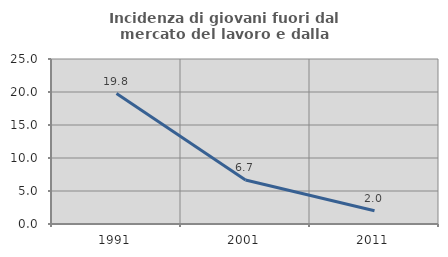
| Category | Incidenza di giovani fuori dal mercato del lavoro e dalla formazione  |
|---|---|
| 1991.0 | 19.767 |
| 2001.0 | 6.667 |
| 2011.0 | 2 |